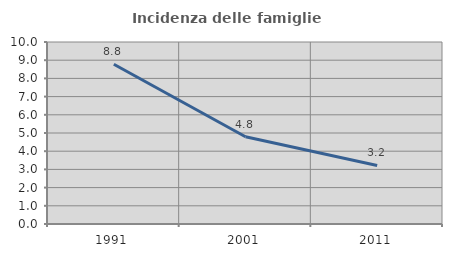
| Category | Incidenza delle famiglie numerose |
|---|---|
| 1991.0 | 8.778 |
| 2001.0 | 4.796 |
| 2011.0 | 3.218 |